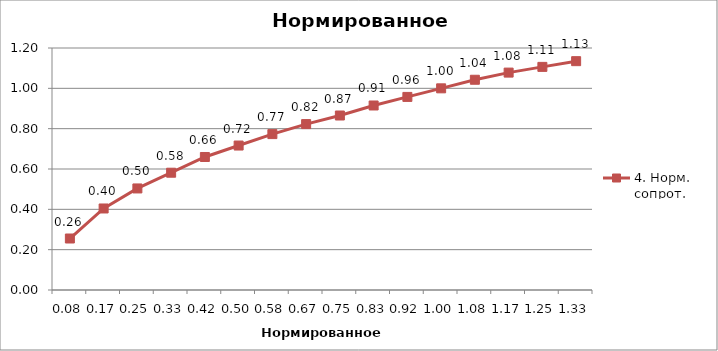
| Category | 4. Норм.
сопрот. |
|---|---|
| 0.08333333333333333 | 0.255 |
| 0.16666666666666666 | 0.404 |
| 0.25 | 0.504 |
| 0.3333333333333333 | 0.582 |
| 0.4166666666666667 | 0.66 |
| 0.5 | 0.716 |
| 0.5833333333333334 | 0.773 |
| 0.6666666666666666 | 0.823 |
| 0.75 | 0.865 |
| 0.8333333333333334 | 0.915 |
| 0.9166666666666666 | 0.957 |
| 1.0 | 1 |
| 1.0833333333333333 | 1.043 |
| 1.1666666666666667 | 1.078 |
| 1.25 | 1.106 |
| 1.3333333333333333 | 1.135 |